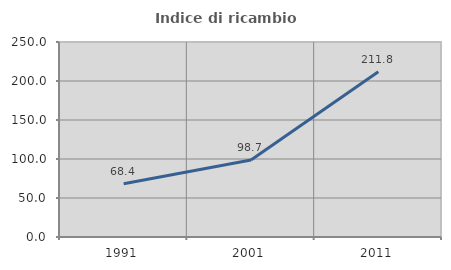
| Category | Indice di ricambio occupazionale  |
|---|---|
| 1991.0 | 68.362 |
| 2001.0 | 98.675 |
| 2011.0 | 211.765 |